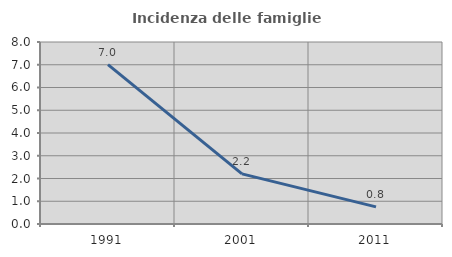
| Category | Incidenza delle famiglie numerose |
|---|---|
| 1991.0 | 7.006 |
| 2001.0 | 2.203 |
| 2011.0 | 0.754 |